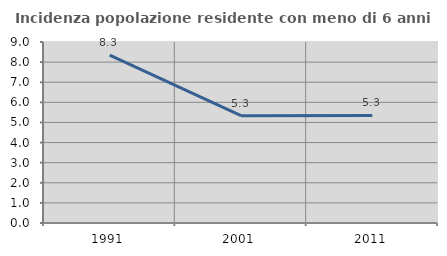
| Category | Incidenza popolazione residente con meno di 6 anni |
|---|---|
| 1991.0 | 8.345 |
| 2001.0 | 5.335 |
| 2011.0 | 5.348 |